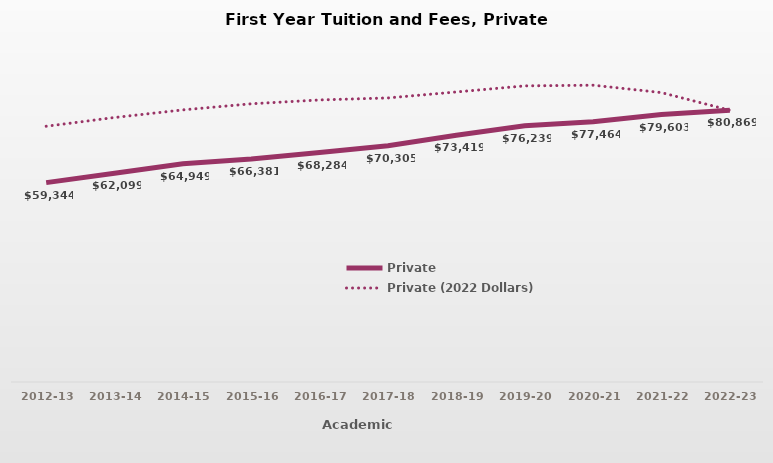
| Category | Private | Private (2022 Dollars) |
|---|---|---|
| 2012-13 | 59344.125 | 76115.99 |
| 2013-14 | 62099.269 | 78716.89 |
| 2014-15 | 64948.5 | 80986.86 |
| 2015-16 | 66381.385 | 82802.38 |
| 2016-17 | 68283.963 | 83947.34 |
| 2017-18 | 70305.37 | 84544.08 |
| 2018-19 | 73419.481 | 86323.22 |
| 2019-20 | 76239.296 | 88130.68 |
| 2020-21 | 77463.667 | 88335.39 |
| 2021-22 | 79603.37 | 86131.78 |
| 2022-23 | 80869 | 80869 |